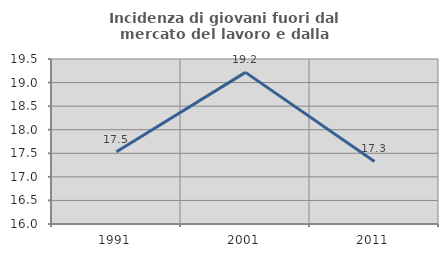
| Category | Incidenza di giovani fuori dal mercato del lavoro e dalla formazione  |
|---|---|
| 1991.0 | 17.532 |
| 2001.0 | 19.216 |
| 2011.0 | 17.328 |